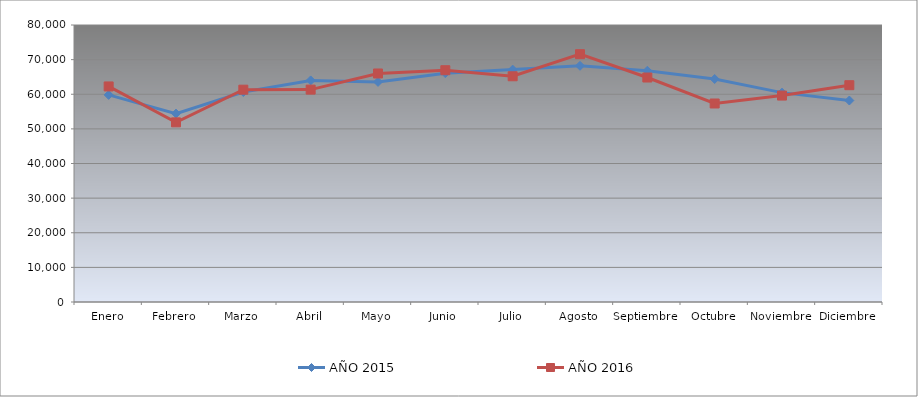
| Category | AÑO 2015 | AÑO 2016 |
|---|---|---|
| Enero | 59809.66 | 62253.371 |
| Febrero | 54412.66 | 51881.333 |
| Marzo | 60640.35 | 61321.608 |
| Abril | 63999.287 | 61337.113 |
| Mayo | 63562.306 | 66000.161 |
| Junio | 66093.392 | 66943.201 |
| Julio | 67114.906 | 65189.625 |
| Agosto | 68214.453 | 71575.237 |
| Septiembre | 66784.333 | 64828.76 |
| Octubre | 64406.474 | 57332.362 |
| Noviembre | 60464.422 | 59616.663 |
| Diciembre | 58186.587 | 62614.236 |